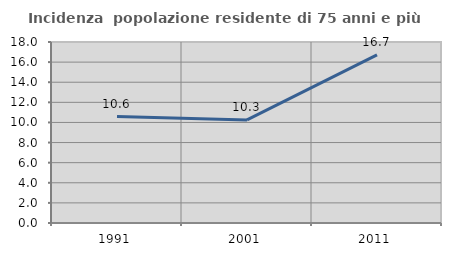
| Category | Incidenza  popolazione residente di 75 anni e più |
|---|---|
| 1991.0 | 10.591 |
| 2001.0 | 10.25 |
| 2011.0 | 16.716 |